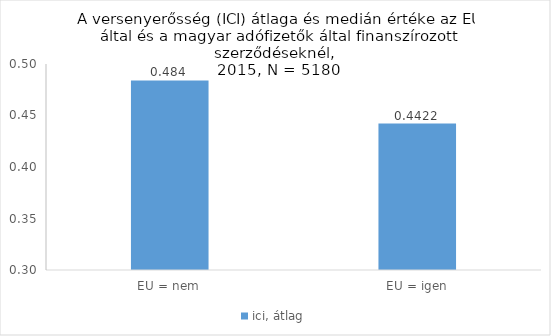
| Category | ici, átlag |
|---|---|
| EU = nem | 0.484 |
| EU = igen | 0.442 |